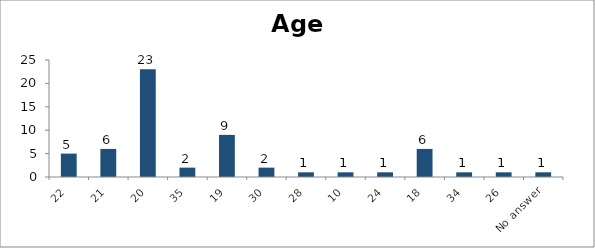
| Category | Age |
|---|---|
| 22 | 5 |
| 21 | 6 |
| 20 | 23 |
| 35 | 2 |
| 19 | 9 |
| 30 | 2 |
| 28 | 1 |
| 10 | 1 |
| 24 | 1 |
| 18 | 6 |
| 34 | 1 |
| 26 | 1 |
| No answer | 1 |